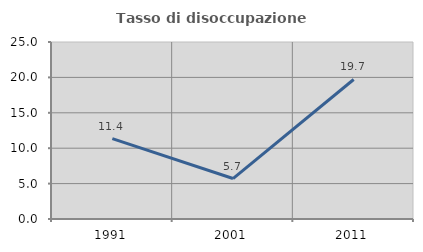
| Category | Tasso di disoccupazione giovanile  |
|---|---|
| 1991.0 | 11.361 |
| 2001.0 | 5.714 |
| 2011.0 | 19.706 |